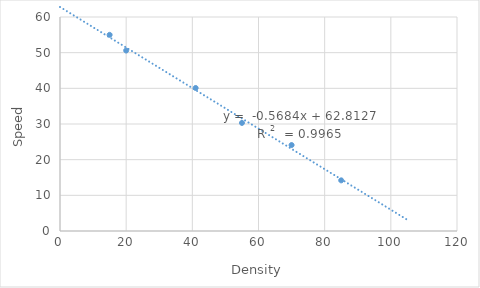
| Category | Series 0 |
|---|---|
| 85.0 | 14.2 |
| 70.0 | 24.1 |
| 55.0 | 30.3 |
| 41.0 | 40.1 |
| 20.0 | 50.6 |
| 15.0 | 55 |